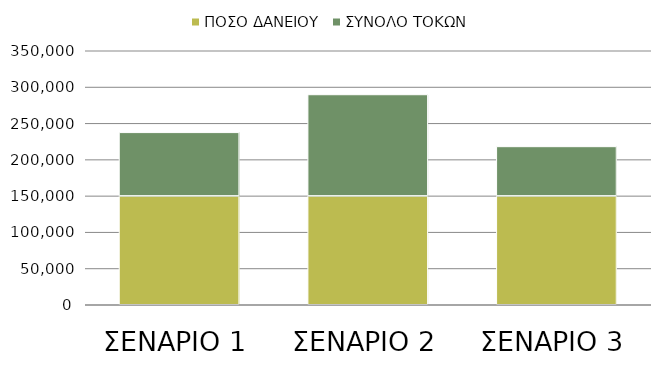
| Category | ΠΟΣΟ ΔΑΝΕΙΟΥ | ΣΥΝΟΛΟ ΤΟΚΩΝ |
|---|---|---|
| ΣΕΝΑΡΙΟ 1 | 150000 | 87584.066 |
| ΣΕΝΑΡΙΟ 2 | 150000 | 139753.762 |
| ΣΕΝΑΡΙΟ 3 | 150000 | 68152.919 |